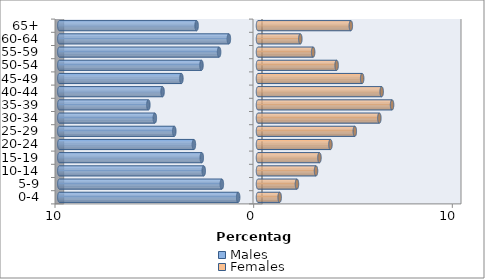
| Category | Males | Females |
|---|---|---|
| 0-4 | -0.999 | 1.09 |
| 5-9 | -1.819 | 1.961 |
| 10-14 | -2.732 | 2.921 |
| 15-19 | -2.829 | 3.093 |
| 20-24 | -3.227 | 3.647 |
| 25-29 | -4.214 | 4.873 |
| 30-34 | -5.193 | 6.108 |
| 35-39 | -5.519 | 6.748 |
| 40-44 | -4.804 | 6.225 |
| 45-49 | -3.855 | 5.243 |
| 50-54 | -2.846 | 3.958 |
| 55-59 | -1.958 | 2.776 |
| 60-64 | -1.466 | 2.131 |
| 65+ | -3.09 | 4.673 |